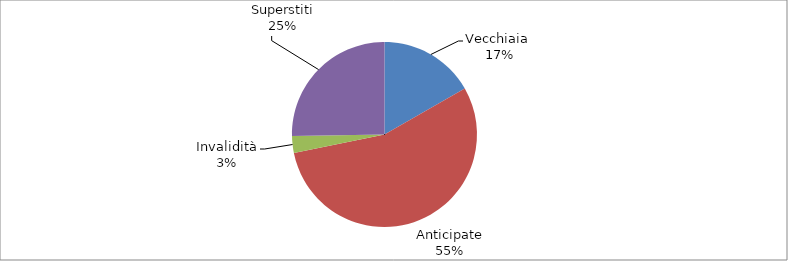
| Category | Series 0 |
|---|---|
| Vecchiaia  | 27759 |
| Anticipate | 91367 |
| Invalidità | 4919 |
| Superstiti | 41893 |